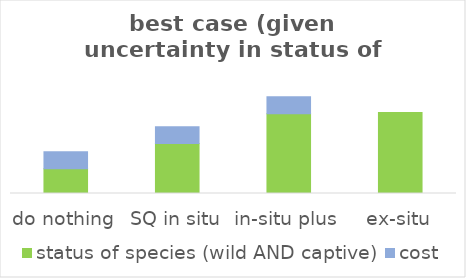
| Category | status of species (wild AND captive) | cost |
|---|---|---|
| do nothing | 0.246 | 0.167 |
| SQ in situ | 0.495 | 0.167 |
| in-situ plus | 0.792 | 0.167 |
| ex-situ | 0.804 | 0 |